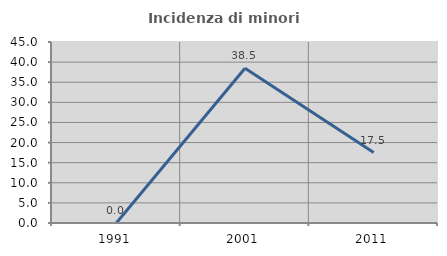
| Category | Incidenza di minori stranieri |
|---|---|
| 1991.0 | 0 |
| 2001.0 | 38.462 |
| 2011.0 | 17.5 |